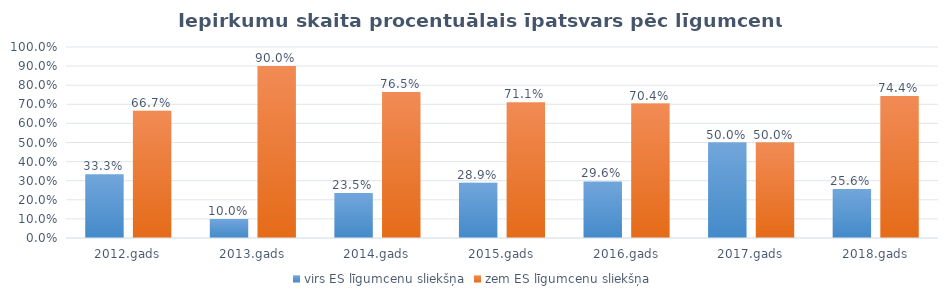
| Category | virs ES līgumcenu sliekšņa | zem ES līgumcenu sliekšņa |
|---|---|---|
| 2012.gads | 0.333 | 0.667 |
| 2013.gads | 0.1 | 0.9 |
| 2014.gads | 0.235 | 0.765 |
| 2015.gads | 0.289 | 0.711 |
| 2016.gads | 0.296 | 0.704 |
| 2017.gads | 0.5 | 0.5 |
| 2018.gads | 0.256 | 0.744 |